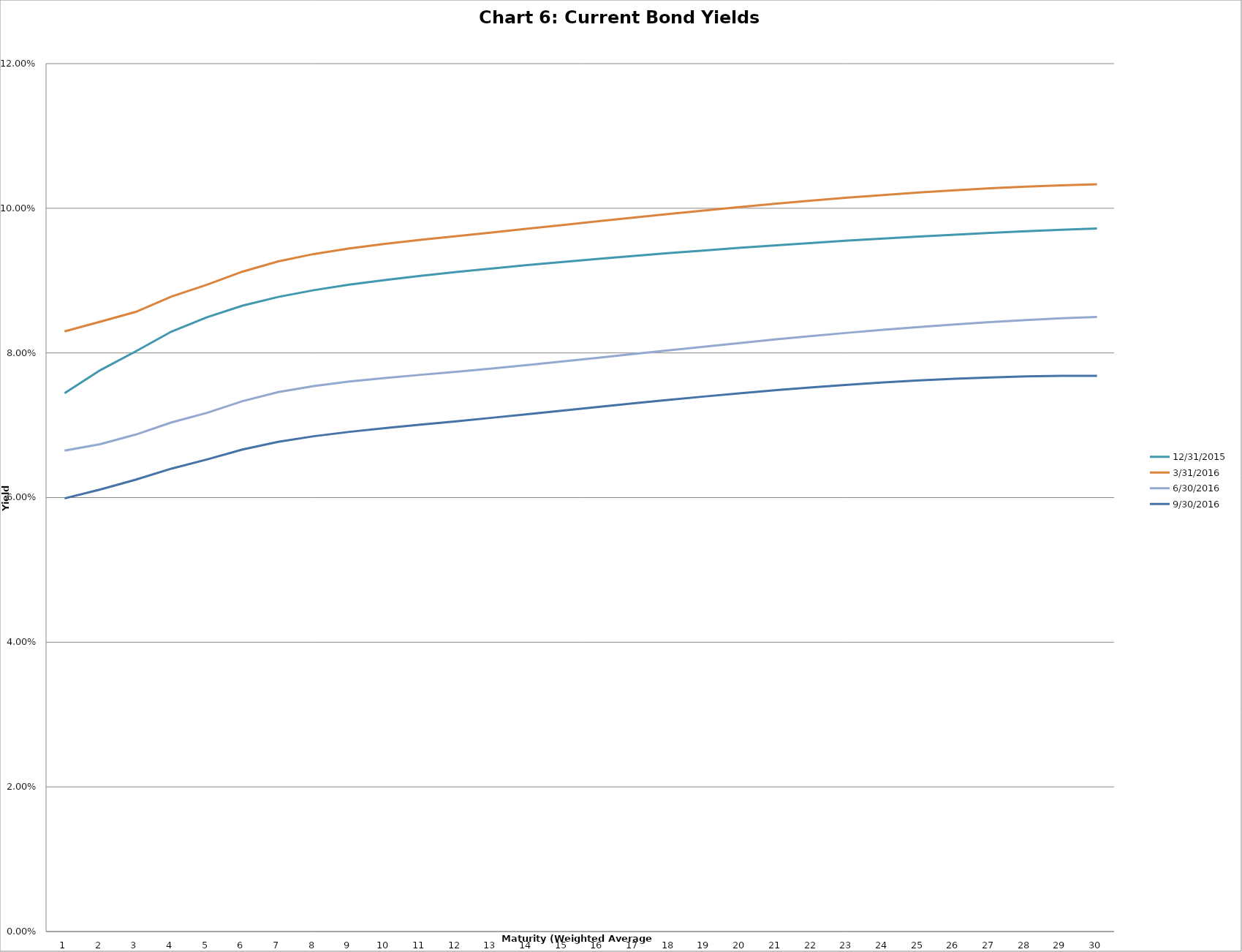
| Category | 12/31/2015 | 3/31/2016 | 6/30/2016 | 9/30/2016 |
|---|---|---|---|---|
| 0 | 0.074 | 0.083 | 0.067 | 0.06 |
| 1 | 0.078 | 0.084 | 0.067 | 0.061 |
| 2 | 0.08 | 0.086 | 0.069 | 0.062 |
| 3 | 0.083 | 0.088 | 0.07 | 0.064 |
| 4 | 0.085 | 0.089 | 0.072 | 0.065 |
| 5 | 0.087 | 0.091 | 0.073 | 0.067 |
| 6 | 0.088 | 0.093 | 0.075 | 0.068 |
| 7 | 0.089 | 0.094 | 0.075 | 0.068 |
| 8 | 0.089 | 0.094 | 0.076 | 0.069 |
| 9 | 0.09 | 0.095 | 0.077 | 0.07 |
| 10 | 0.091 | 0.096 | 0.077 | 0.07 |
| 11 | 0.091 | 0.096 | 0.077 | 0.071 |
| 12 | 0.092 | 0.097 | 0.078 | 0.071 |
| 13 | 0.092 | 0.097 | 0.078 | 0.072 |
| 14 | 0.093 | 0.098 | 0.079 | 0.072 |
| 15 | 0.093 | 0.098 | 0.079 | 0.073 |
| 16 | 0.093 | 0.099 | 0.08 | 0.073 |
| 17 | 0.094 | 0.099 | 0.08 | 0.074 |
| 18 | 0.094 | 0.1 | 0.081 | 0.074 |
| 19 | 0.095 | 0.1 | 0.081 | 0.074 |
| 20 | 0.095 | 0.101 | 0.082 | 0.075 |
| 21 | 0.095 | 0.101 | 0.082 | 0.075 |
| 22 | 0.096 | 0.101 | 0.083 | 0.076 |
| 23 | 0.096 | 0.102 | 0.083 | 0.076 |
| 24 | 0.096 | 0.102 | 0.084 | 0.076 |
| 25 | 0.096 | 0.102 | 0.084 | 0.076 |
| 26 | 0.097 | 0.103 | 0.084 | 0.077 |
| 27 | 0.097 | 0.103 | 0.085 | 0.077 |
| 28 | 0.097 | 0.103 | 0.085 | 0.077 |
| 29 | 0.097 | 0.103 | 0.085 | 0.077 |